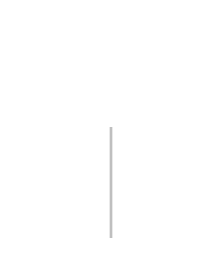
| Category | Positivo | Negativo |
|---|---|---|
| 0 | 0 | 0 |
| 1 | 192 | 0 |
| 2 | 192 | -192 |